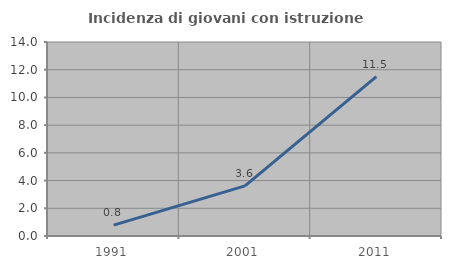
| Category | Incidenza di giovani con istruzione universitaria |
|---|---|
| 1991.0 | 0.783 |
| 2001.0 | 3.618 |
| 2011.0 | 11.496 |